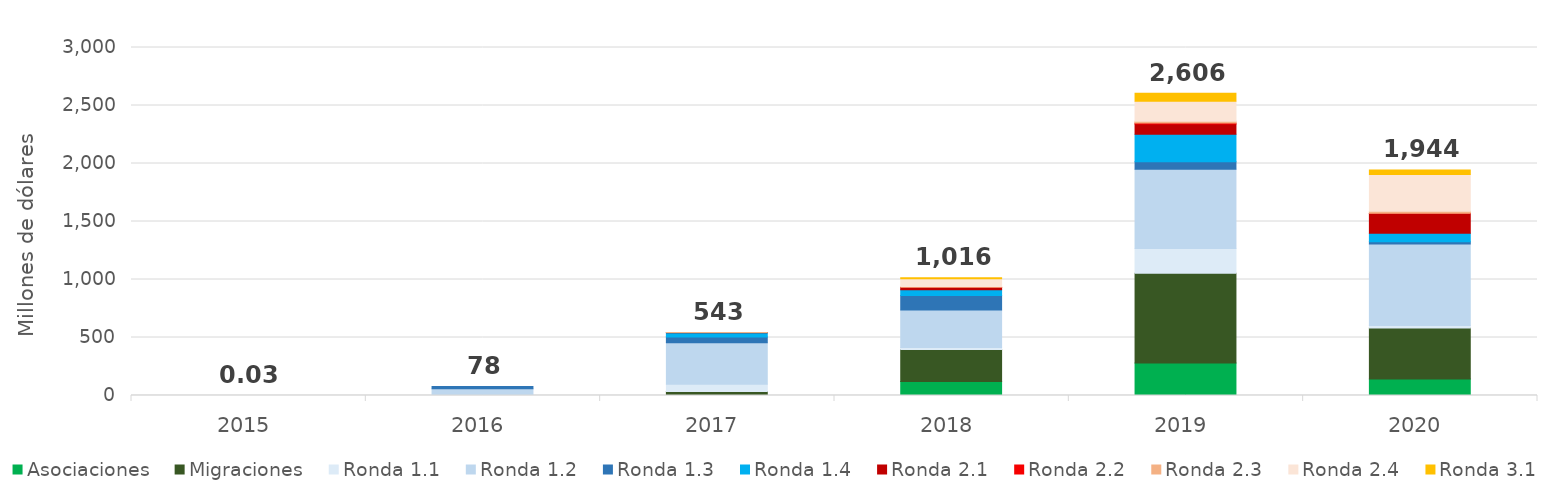
| Category | Asociaciones | Migraciones | Ronda 1.1 | Ronda 1.2 | Ronda 1.3 | Ronda 1.4 | Ronda 2.1 | Ronda 2.2 | Ronda 2.3 | Ronda 2.4 | Ronda 3.1 |
|---|---|---|---|---|---|---|---|---|---|---|---|
| 2015.0 | 0 | 0 | 0.023 | 0.003 | 0 | 0 | 0 | 0 | 0 | 0 | 0 |
| 2016.0 | 0 | 0 | 7.936 | 50.903 | 19.085 | 0 | 0 | 0 | 0 | 0 | 0 |
| 2017.0 | 1.551 | 32.93 | 63.439 | 356.292 | 49.073 | 38.707 | 0.93 | 0 | 0.096 | 0 | 0 |
| 2018.0 | 121.371 | 276.221 | 16.154 | 323.201 | 126.084 | 47.616 | 21.584 | 0.684 | 6.896 | 66.16 | 9.669 |
| 2019.0 | 280.617 | 772.208 | 213.486 | 685.106 | 64.331 | 235.595 | 88.72 | 9.324 | 14.622 | 173.042 | 69.349 |
| 2020.0 | 143.228 | 439.094 | 22.028 | 702.642 | 17.508 | 73.136 | 171.054 | 1.788 | 17.778 | 317.942 | 38.074 |